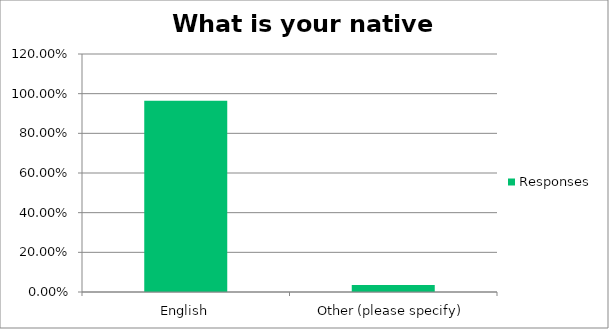
| Category | Responses |
|---|---|
| English | 0.965 |
| Other (please specify) | 0.035 |